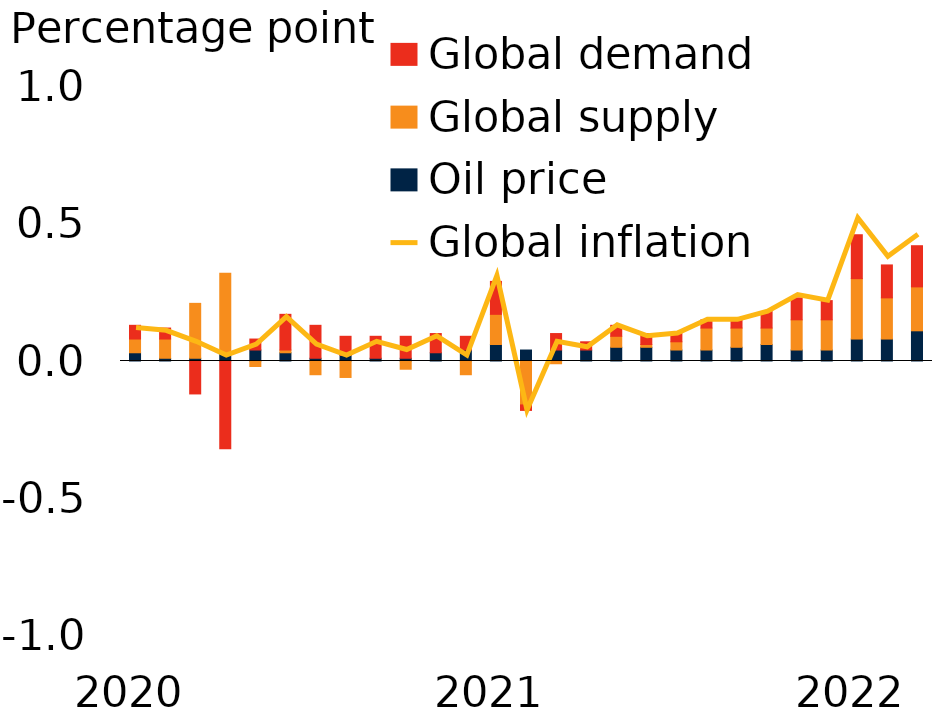
| Category | Oil price | Global supply | Global demand |
|---|---|---|---|
| 2020 | 0.03 | 0.05 | 0.05 |
| 2020m2 | 0.01 | 0.07 | 0.04 |
| 2020m3 | 0.01 | 0.2 | -0.12 |
| 2020m4 | 0.03 | 0.29 | -0.32 |
| 2020m5 | 0.04 | -0.02 | 0.04 |
| 2020m6 | 0.03 | 0.01 | 0.13 |
| 2020m7 | 0.01 | -0.05 | 0.12 |
| 2020m8 | 0.02 | -0.06 | 0.07 |
| 2020m9 | 0.01 | 0 | 0.08 |
| 2020m10 | 0.01 | -0.03 | 0.08 |
| 2020m11 | 0.03 | 0 | 0.07 |
| 2020m12 | 0.04 | -0.05 | 0.05 |
| 2021 | 0.06 | 0.11 | 0.12 |
| 2021m2 | 0.04 | -0.16 | -0.02 |
| 2021m3 | 0.04 | -0.01 | 0.06 |
| 2021m4 | 0.04 | 0 | 0.03 |
| 2021m5 | 0.05 | 0.04 | 0.04 |
| 2021m6 | 0.05 | 0.01 | 0.04 |
| 2021m7 | 0.04 | 0.03 | 0.03 |
| 2021m8 | 0.04 | 0.08 | 0.03 |
| 2021m9 | 0.05 | 0.07 | 0.03 |
| 2021m10 | 0.06 | 0.06 | 0.06 |
| 2021m11 | 0.04 | 0.11 | 0.08 |
| 2021m12 | 0.04 | 0.11 | 0.07 |
| 2022 | 0.08 | 0.22 | 0.16 |
| 2022m2 | 0.08 | 0.15 | 0.12 |
| 2022m3 | 0.11 | 0.16 | 0.15 |